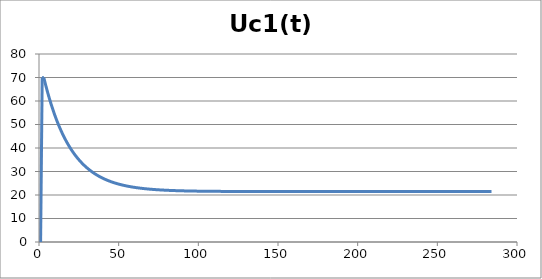
| Category | Uc1(t) |
|---|---|
| 0 | 0 |
| 1 | 70 |
| 2 | 70 |
| 3 | 67.269 |
| 4 | 64.691 |
| 5 | 62.258 |
| 6 | 59.963 |
| 7 | 57.796 |
| 8 | 55.751 |
| 9 | 53.821 |
| 10 | 52 |
| 11 | 50.281 |
| 12 | 48.659 |
| 13 | 47.128 |
| 14 | 45.683 |
| 15 | 44.32 |
| 16 | 43.033 |
| 17 | 41.819 |
| 18 | 40.673 |
| 19 | 39.591 |
| 20 | 38.57 |
| 21 | 37.607 |
| 22 | 36.698 |
| 23 | 35.84 |
| 24 | 35.03 |
| 25 | 34.266 |
| 26 | 33.545 |
| 27 | 32.864 |
| 28 | 32.222 |
| 29 | 31.616 |
| 30 | 31.043 |
| 31 | 30.504 |
| 32 | 29.994 |
| 33 | 29.513 |
| 34 | 29.06 |
| 35 | 28.631 |
| 36 | 28.227 |
| 37 | 27.846 |
| 38 | 27.486 |
| 39 | 27.146 |
| 40 | 26.826 |
| 41 | 26.523 |
| 42 | 26.238 |
| 43 | 25.969 |
| 44 | 25.715 |
| 45 | 25.475 |
| 46 | 25.248 |
| 47 | 25.035 |
| 48 | 24.833 |
| 49 | 24.643 |
| 50 | 24.463 |
| 51 | 24.294 |
| 52 | 24.134 |
| 53 | 23.983 |
| 54 | 23.841 |
| 55 | 23.707 |
| 56 | 23.58 |
| 57 | 23.46 |
| 58 | 23.347 |
| 59 | 23.241 |
| 60 | 23.14 |
| 61 | 23.046 |
| 62 | 22.956 |
| 63 | 22.872 |
| 64 | 22.792 |
| 65 | 22.717 |
| 66 | 22.646 |
| 67 | 22.579 |
| 68 | 22.516 |
| 69 | 22.456 |
| 70 | 22.4 |
| 71 | 22.347 |
| 72 | 22.297 |
| 73 | 22.25 |
| 74 | 22.205 |
| 75 | 22.163 |
| 76 | 22.124 |
| 77 | 22.086 |
| 78 | 22.051 |
| 79 | 22.018 |
| 80 | 21.986 |
| 81 | 21.957 |
| 82 | 21.929 |
| 83 | 21.903 |
| 84 | 21.878 |
| 85 | 21.854 |
| 86 | 21.832 |
| 87 | 21.811 |
| 88 | 21.792 |
| 89 | 21.773 |
| 90 | 21.756 |
| 91 | 21.739 |
| 92 | 21.724 |
| 93 | 21.709 |
| 94 | 21.695 |
| 95 | 21.682 |
| 96 | 21.67 |
| 97 | 21.658 |
| 98 | 21.647 |
| 99 | 21.637 |
| 100 | 21.627 |
| 101 | 21.618 |
| 102 | 21.61 |
| 103 | 21.601 |
| 104 | 21.594 |
| 105 | 21.587 |
| 106 | 21.58 |
| 107 | 21.573 |
| 108 | 21.567 |
| 109 | 21.562 |
| 110 | 21.556 |
| 111 | 21.551 |
| 112 | 21.547 |
| 113 | 21.542 |
| 114 | 21.538 |
| 115 | 21.534 |
| 116 | 21.53 |
| 117 | 21.527 |
| 118 | 21.523 |
| 119 | 21.52 |
| 120 | 21.517 |
| 121 | 21.515 |
| 122 | 21.512 |
| 123 | 21.51 |
| 124 | 21.507 |
| 125 | 21.505 |
| 126 | 21.503 |
| 127 | 21.501 |
| 128 | 21.5 |
| 129 | 21.498 |
| 130 | 21.496 |
| 131 | 21.495 |
| 132 | 21.494 |
| 133 | 21.492 |
| 134 | 21.491 |
| 135 | 21.49 |
| 136 | 21.489 |
| 137 | 21.488 |
| 138 | 21.487 |
| 139 | 21.486 |
| 140 | 21.485 |
| 141 | 21.484 |
| 142 | 21.484 |
| 143 | 21.483 |
| 144 | 21.483 |
| 145 | 21.482 |
| 146 | 21.481 |
| 147 | 21.481 |
| 148 | 21.48 |
| 149 | 21.48 |
| 150 | 21.48 |
| 151 | 21.479 |
| 152 | 21.479 |
| 153 | 21.479 |
| 154 | 21.478 |
| 155 | 21.478 |
| 156 | 21.478 |
| 157 | 21.478 |
| 158 | 21.477 |
| 159 | 21.477 |
| 160 | 21.477 |
| 161 | 21.477 |
| 162 | 21.477 |
| 163 | 21.477 |
| 164 | 21.477 |
| 165 | 21.476 |
| 166 | 21.476 |
| 167 | 21.476 |
| 168 | 21.476 |
| 169 | 21.476 |
| 170 | 21.476 |
| 171 | 21.476 |
| 172 | 21.476 |
| 173 | 21.476 |
| 174 | 21.476 |
| 175 | 21.476 |
| 176 | 21.476 |
| 177 | 21.476 |
| 178 | 21.476 |
| 179 | 21.476 |
| 180 | 21.476 |
| 181 | 21.476 |
| 182 | 21.476 |
| 183 | 21.476 |
| 184 | 21.476 |
| 185 | 21.476 |
| 186 | 21.476 |
| 187 | 21.476 |
| 188 | 21.476 |
| 189 | 21.476 |
| 190 | 21.476 |
| 191 | 21.477 |
| 192 | 21.477 |
| 193 | 21.477 |
| 194 | 21.477 |
| 195 | 21.477 |
| 196 | 21.477 |
| 197 | 21.477 |
| 198 | 21.477 |
| 199 | 21.477 |
| 200 | 21.477 |
| 201 | 21.477 |
| 202 | 21.477 |
| 203 | 21.477 |
| 204 | 21.477 |
| 205 | 21.477 |
| 206 | 21.477 |
| 207 | 21.478 |
| 208 | 21.478 |
| 209 | 21.478 |
| 210 | 21.478 |
| 211 | 21.478 |
| 212 | 21.478 |
| 213 | 21.478 |
| 214 | 21.478 |
| 215 | 21.478 |
| 216 | 21.478 |
| 217 | 21.478 |
| 218 | 21.478 |
| 219 | 21.478 |
| 220 | 21.478 |
| 221 | 21.479 |
| 222 | 21.479 |
| 223 | 21.479 |
| 224 | 21.479 |
| 225 | 21.479 |
| 226 | 21.479 |
| 227 | 21.479 |
| 228 | 21.479 |
| 229 | 21.479 |
| 230 | 21.479 |
| 231 | 21.479 |
| 232 | 21.479 |
| 233 | 21.479 |
| 234 | 21.479 |
| 235 | 21.479 |
| 236 | 21.48 |
| 237 | 21.48 |
| 238 | 21.48 |
| 239 | 21.48 |
| 240 | 21.48 |
| 241 | 21.48 |
| 242 | 21.48 |
| 243 | 21.48 |
| 244 | 21.48 |
| 245 | 21.48 |
| 246 | 21.48 |
| 247 | 21.48 |
| 248 | 21.48 |
| 249 | 21.48 |
| 250 | 21.48 |
| 251 | 21.48 |
| 252 | 21.48 |
| 253 | 21.481 |
| 254 | 21.481 |
| 255 | 21.481 |
| 256 | 21.481 |
| 257 | 21.481 |
| 258 | 21.481 |
| 259 | 21.481 |
| 260 | 21.481 |
| 261 | 21.481 |
| 262 | 21.481 |
| 263 | 21.481 |
| 264 | 21.481 |
| 265 | 21.481 |
| 266 | 21.481 |
| 267 | 21.481 |
| 268 | 21.481 |
| 269 | 21.481 |
| 270 | 21.481 |
| 271 | 21.481 |
| 272 | 21.481 |
| 273 | 21.482 |
| 274 | 21.482 |
| 275 | 21.482 |
| 276 | 21.482 |
| 277 | 21.482 |
| 278 | 21.482 |
| 279 | 21.482 |
| 280 | 21.482 |
| 281 | 21.482 |
| 282 | 21.482 |
| 283 | 21.482 |